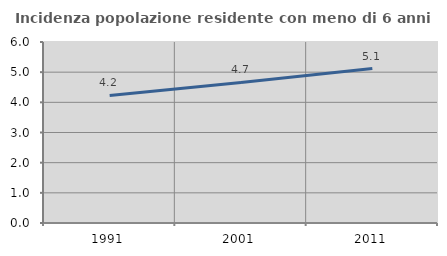
| Category | Incidenza popolazione residente con meno di 6 anni |
|---|---|
| 1991.0 | 4.227 |
| 2001.0 | 4.658 |
| 2011.0 | 5.118 |